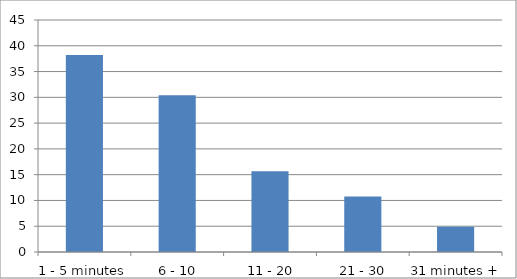
| Category | Series 0 |
|---|---|
| 1 - 5 minutes | 38.235 |
| 6 - 10 minutes | 30.392 |
| 11 - 20 minutes | 15.686 |
| 21 - 30 minutes | 10.784 |
| 31 minutes + | 4.902 |